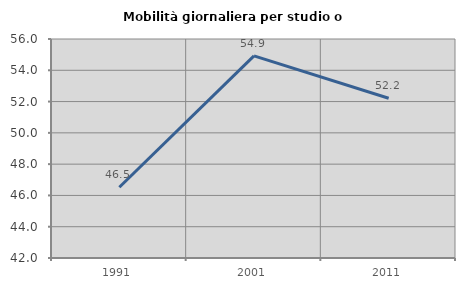
| Category | Mobilità giornaliera per studio o lavoro |
|---|---|
| 1991.0 | 46.522 |
| 2001.0 | 54.917 |
| 2011.0 | 52.209 |